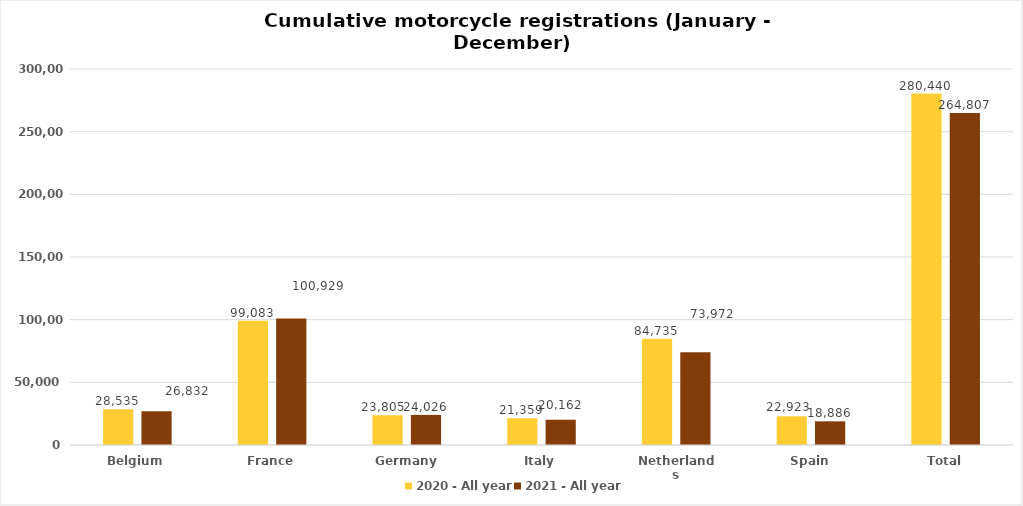
| Category | 2020 - All year | 2021 - All year |
|---|---|---|
| Belgium | 28535 | 26832 |
| France | 99083 | 100929 |
| Germany | 23805 | 24026 |
| Italy | 21359 | 20162 |
| Netherlands | 84735 | 73972 |
| Spain | 22923 | 18886 |
| Total | 280440 | 264807 |